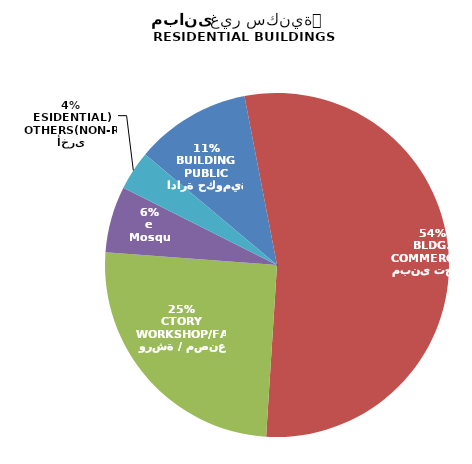
| Category | Series 0 |
|---|---|
| ادارة حكومية
PUBLIC BUILDING | 47 |
| مبنى تجاري
COMMERCIAL BLDG. | 234 |
| ورشة / مصنع
WORKSHOP/FACTORY | 109 |
| مسجد
Mosque | 27 |
| أخرى
OTHERS(NON-RESIDENTIAL) | 16 |